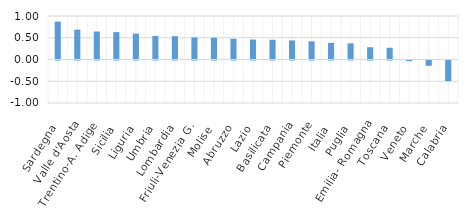
| Category | Series 0 |
|---|---|
| Sardegna | 0.871 |
| Valle d'Aosta | 0.686 |
| Trentino-A. Adige | 0.643 |
| Sicilia | 0.629 |
| Liguria | 0.596 |
| Umbria | 0.541 |
| Lombardia | 0.536 |
| Friuli-Venezia G. | 0.508 |
| Molise | 0.502 |
| Abruzzo | 0.477 |
| Lazio | 0.457 |
| Basilicata | 0.453 |
| Campania | 0.438 |
| Piemonte | 0.418 |
| Italia | 0.383 |
| Puglia | 0.372 |
| Emilia- Romagna | 0.282 |
| Toscana | 0.27 |
| Veneto | -0.014 |
| Marche | -0.123 |
| Calabria | -0.474 |